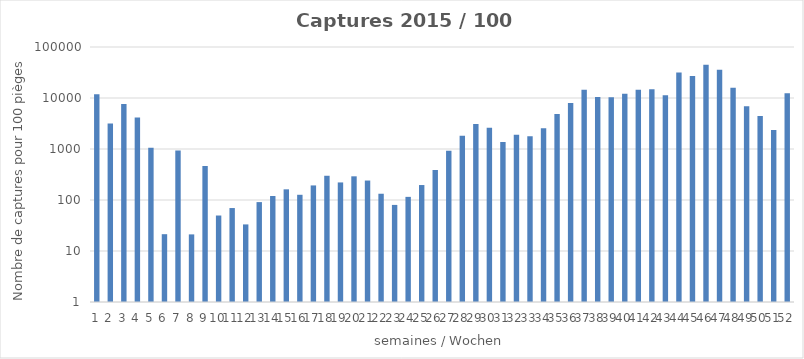
| Category | Series 0 |
|---|---|
| 0 | 11811.25 |
| 1 | 3156.081 |
| 2 | 7627.419 |
| 3 | 4158.491 |
| 4 | 1055.634 |
| 5 | 21.364 |
| 6 | 933.065 |
| 7 | 21.171 |
| 8 | 464.198 |
| 9 | 49.63 |
| 10 | 69.54 |
| 11 | 33.219 |
| 12 | 90.952 |
| 13 | 119.708 |
| 14 | 161.842 |
| 15 | 126.543 |
| 16 | 193.066 |
| 17 | 298.775 |
| 18 | 221.034 |
| 19 | 291.337 |
| 20 | 240.774 |
| 21 | 132.658 |
| 22 | 80.1 |
| 23 | 115.19 |
| 24 | 196.5 |
| 25 | 389.369 |
| 26 | 921.791 |
| 27 | 1820.755 |
| 28 | 3091.189 |
| 29 | 2603.802 |
| 30 | 1368.75 |
| 31 | 1901.053 |
| 32 | 1783.039 |
| 33 | 2546.844 |
| 34 | 4854.237 |
| 35 | 7962.585 |
| 36 | 14440.688 |
| 37 | 10446.398 |
| 38 | 10349.39 |
| 39 | 12055.046 |
| 40 | 14454.335 |
| 41 | 14900.73 |
| 42 | 11366.942 |
| 43 | 31645.349 |
| 44 | 26979.126 |
| 45 | 44997.706 |
| 46 | 35625.253 |
| 47 | 15965.714 |
| 48 | 6926.667 |
| 49 | 4412.371 |
| 50 | 2356.604 |
| 51 | 12360.938 |